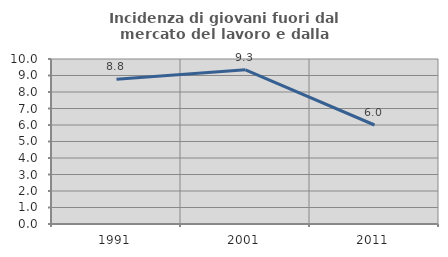
| Category | Incidenza di giovani fuori dal mercato del lavoro e dalla formazione  |
|---|---|
| 1991.0 | 8.772 |
| 2001.0 | 9.346 |
| 2011.0 | 6 |